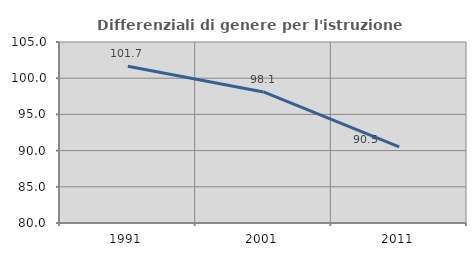
| Category | Differenziali di genere per l'istruzione superiore |
|---|---|
| 1991.0 | 101.652 |
| 2001.0 | 98.101 |
| 2011.0 | 90.521 |